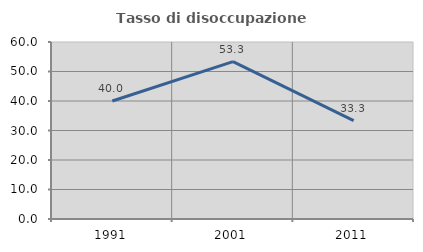
| Category | Tasso di disoccupazione giovanile  |
|---|---|
| 1991.0 | 40 |
| 2001.0 | 53.333 |
| 2011.0 | 33.333 |